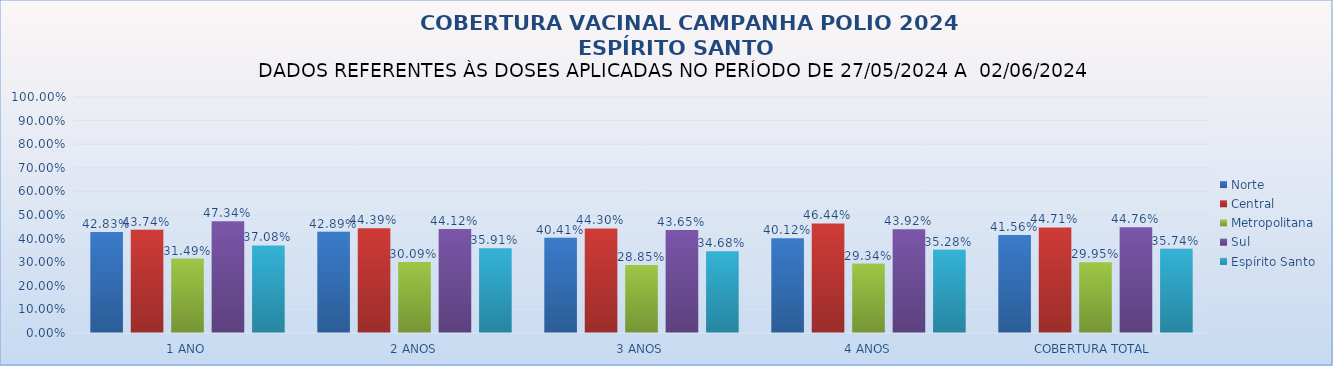
| Category | Norte | Central | Metropolitana | Sul | Espírito Santo |
|---|---|---|---|---|---|
| 1 ANO | 0.428 | 0.437 | 0.315 | 0.473 | 0.371 |
| 2 ANOS | 0.429 | 0.444 | 0.301 | 0.441 | 0.359 |
| 3 ANOS | 0.404 | 0.443 | 0.288 | 0.436 | 0.347 |
| 4 ANOS | 0.401 | 0.464 | 0.293 | 0.439 | 0.353 |
| COBERTURA TOTAL | 0.416 | 0.447 | 0.299 | 0.448 | 0.357 |